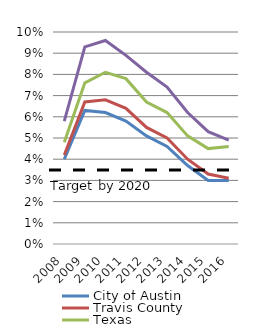
| Category | City of Austin | Travis County | Texas | USA |
|---|---|---|---|---|
| 2008.0 | 0.04 | 0.042 | 0.048 | 0.058 |
| 2009.0 | 0.063 | 0.067 | 0.076 | 0.093 |
| 2010.0 | 0.062 | 0.068 | 0.081 | 0.096 |
| 2011.0 | 0.058 | 0.064 | 0.078 | 0.089 |
| 2012.0 | 0.051 | 0.055 | 0.067 | 0.081 |
| 2013.0 | 0.046 | 0.05 | 0.062 | 0.074 |
| 2014.0 | 0.037 | 0.04 | 0.051 | 0.062 |
| 2015.0 | 0.03 | 0.033 | 0.045 | 0.053 |
| 2016.0 | 0.03 | 0.031 | 0.046 | 0.049 |